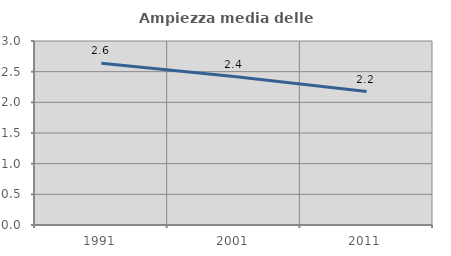
| Category | Ampiezza media delle famiglie |
|---|---|
| 1991.0 | 2.637 |
| 2001.0 | 2.42 |
| 2011.0 | 2.175 |